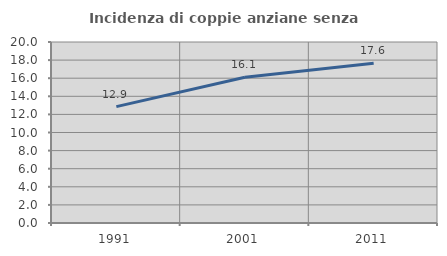
| Category | Incidenza di coppie anziane senza figli  |
|---|---|
| 1991.0 | 12.859 |
| 2001.0 | 16.114 |
| 2011.0 | 17.647 |